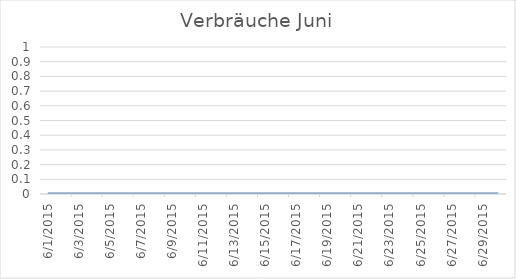
| Category | Series 0 |
|---|---|
| 01/06/2015 | 0 |
| 02/06/2015 | 0 |
| 03/06/2015 | 0 |
| 04/06/2015 | 0 |
| 05/06/2015 | 0 |
| 06/06/2015 | 0 |
| 07/06/2015 | 0 |
| 08/06/2015 | 0 |
| 09/06/2015 | 0 |
| 10/06/2015 | 0 |
| 11/06/2015 | 0 |
| 12/06/2015 | 0 |
| 13/06/2015 | 0 |
| 14/06/2015 | 0 |
| 15/06/2015 | 0 |
| 16/06/2015 | 0 |
| 17/06/2015 | 0 |
| 18/06/2015 | 0 |
| 19/06/2015 | 0 |
| 20/06/2015 | 0 |
| 21/06/2015 | 0 |
| 22/06/2015 | 0 |
| 23/06/2015 | 0 |
| 24/06/2015 | 0 |
| 25/06/2015 | 0 |
| 26/06/2015 | 0 |
| 27/06/2015 | 0 |
| 28/06/2015 | 0 |
| 29/06/2015 | 0 |
| 30/06/2015 | 0 |